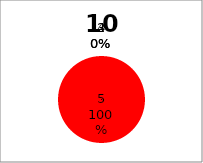
| Category | Series 0 |
|---|---|
| 5.0 | 8 |
| 4.0 | 0 |
| 3.0 | 0 |
| 2.0 | 0 |